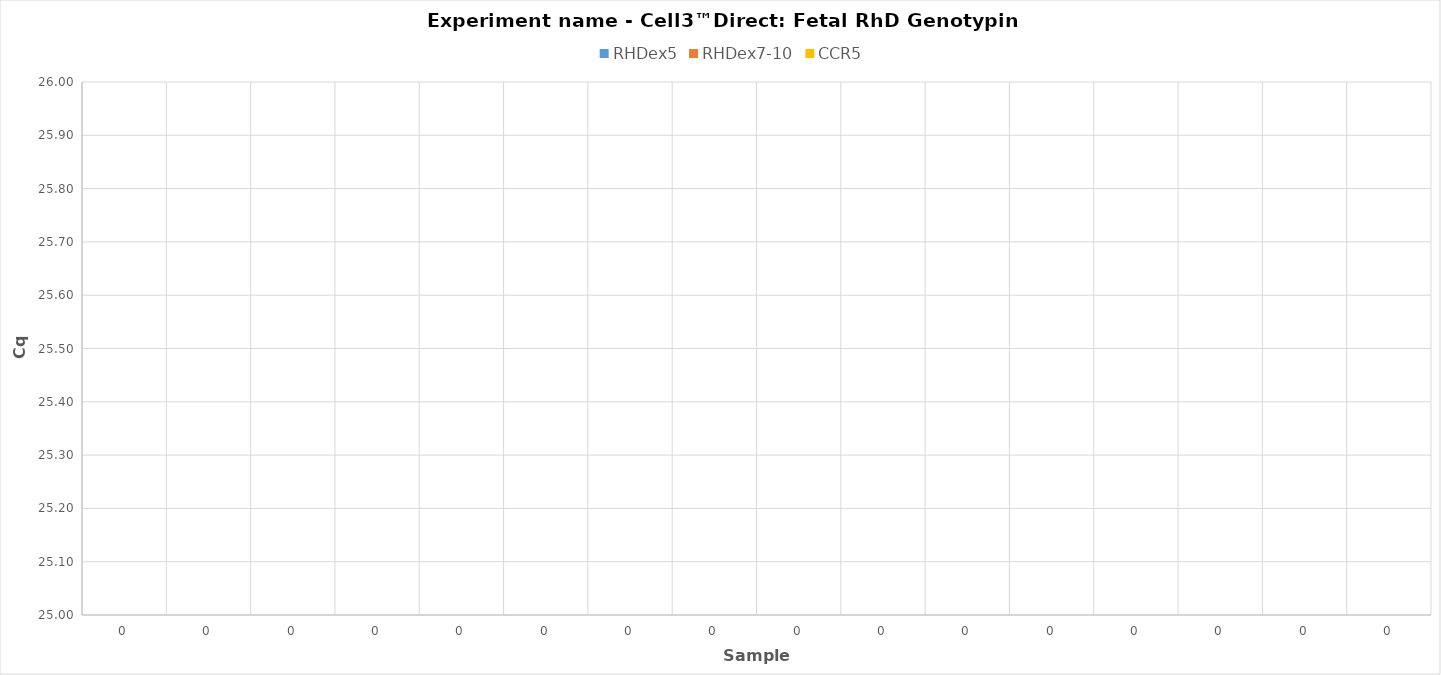
| Category | RHDex5 | RHDex7-10 | CCR5 |
|---|---|---|---|
| 0.0 | 0 | 0 | 0 |
| 0.0 | 0 | 0 | 0 |
| 0.0 | 0 | 0 | 0 |
| 0.0 | 0 | 0 | 0 |
| 0.0 | 0 | 0 | 0 |
| 0.0 | 0 | 0 | 0 |
| 0.0 | 0 | 0 | 0 |
| 0.0 | 0 | 0 | 0 |
| 0.0 | 0 | 0 | 0 |
| 0.0 | 0 | 0 | 0 |
| 0.0 | 0 | 0 | 0 |
| 0.0 | 0 | 0 | 0 |
| 0.0 | 0 | 0 | 0 |
| 0.0 | 0 | 0 | 0 |
| 0.0 | 0 | 0 | 0 |
| 0.0 | 0 | 0 | 0 |